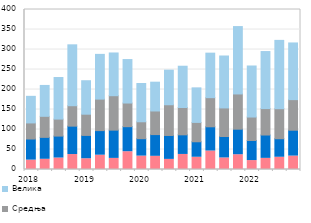
| Category | Микропредузећа | Мала | Средња | Велика |
|---|---|---|---|---|
| 2018-01-01 | 23.458 | 52.774 | 40.183 | 66.517 |
| nan | 25.544 | 54.802 | 52.603 | 77.229 |
| nan | 28.673 | 54.873 | 42.484 | 103.899 |
| nan | 37.41 | 70.984 | 51.038 | 152.215 |
| 2019-01-01 | 26.913 | 58.293 | 53.033 | 83.702 |
| nan | 35.763 | 61.475 | 78.723 | 111.897 |
| nan | 27.759 | 70.634 | 86.103 | 106.825 |
| nan | 44.489 | 62.561 | 59.132 | 108.665 |
| 2020-01-01 | 33.497 | 43.549 | 42.255 | 95.672 |
| nan | 32.961 | 54.332 | 59.003 | 72.028 |
| nan | 25.293 | 59.78 | 76.792 | 86.501 |
| nan | 37.626 | 49.063 | 68.305 | 103.2 |
| 2021-01-01 | 30.617 | 38.71 | 48.392 | 86.375 |
| nan | 46.211 | 60.56 | 72.812 | 111.3 |
| nan | 28.92 | 53.554 | 71.432 | 129.875 |
| nan | 36.942 | 63.823 | 88.096 | 168.441 |
| 2022-01-01 | 22.354 | 50.182 | 58.632 | 127.609 |
| nan | 27.832 | 58.376 | 66.052 | 142.611 |
| nan | 30.614 | 46.302 | 75.083 | 170.789 |
| nan | 33.536 | 64.652 | 76.471 | 141.718 |